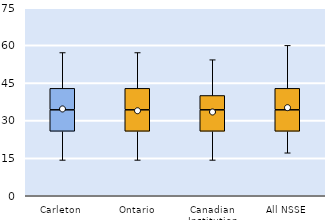
| Category | 25th | 50th | 75th |
|---|---|---|---|
| Carleton | 25.714 | 8.571 | 8.571 |
| Ontario | 25.714 | 8.571 | 8.571 |
| Canadian Institution | 25.714 | 8.571 | 5.714 |
| All NSSE | 25.714 | 8.571 | 8.571 |